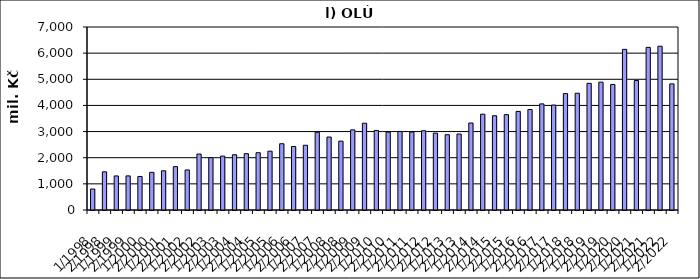
| Category | Series 0 |
|---|---|
| 1/1998 | 803741.058 |
| 2/1998 | 1460404.442 |
| 1/1999 | 1302272.291 |
| 2/1999 | 1304151.709 |
| 1/2000 | 1282995.137 |
| 2/2000 | 1439798.363 |
| 1/2001 | 1499100.677 |
| 2/2001 | 1658392.322 |
| 1/2002 | 1531635 |
| 2/2002 | 2140241 |
| 1/2003 | 2000033 |
| 2/2003 | 2060674.187 |
| 1/2004 | 2113153.033 |
| 2/2004 | 2154600.451 |
| 1/2005 | 2191332 |
| 2/2005 | 2249658.12 |
| 1/2006 | 2534201 |
| 2/2006 | 2428453 |
| 1/2007 | 2476277 |
| 2/2007 | 2973044 |
| 1/2008 | 2790596.364 |
| 2/2008 | 2634424.636 |
| 1/2009 | 3064335.739 |
| 2/2009 | 3318826 |
| 1/2010 | 3043488 |
| 2/2010 | 2979421 |
| 1/2011 | 3004169 |
| 2/2011 | 2983388 |
| 1/2012 | 3031616 |
| 2/2012 | 2940319 |
| 1/2013 | 2879762 |
| 2/2013 | 2905432 |
| 1/2014 | 3327502 |
| 2/2014 | 3664843 |
| 1/2015 | 3604729 |
| 2/2015 | 3648186 |
| 1/2016 | 3770703 |
| 2/2016 | 3843117 |
| 1/2017 | 4058301 |
| 2/2017 | 4013415 |
| 1/2018 | 4453077.112 |
| 2/2018 | 4465262.618 |
| 1/2019 | 4844443.58 |
| 2/2019 | 4889890.565 |
| 1/2020 | 4801792.328 |
| 2/2020 | 6144239.672 |
| 1/2021 | 4952939.597 |
| 2/2021 | 6219788.277 |
| 1/2022 | 6263884.65 |
| 2/2022 | 4824040.62 |